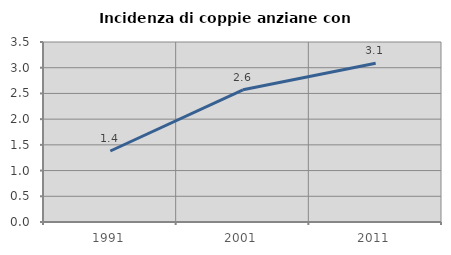
| Category | Incidenza di coppie anziane con figli |
|---|---|
| 1991.0 | 1.381 |
| 2001.0 | 2.57 |
| 2011.0 | 3.088 |